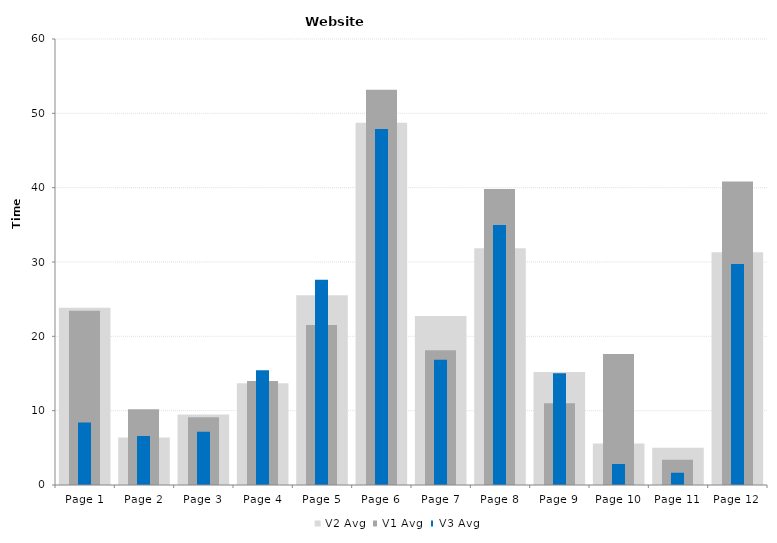
| Category | V2 Avg | V1 Avg | V3 Avg |
|---|---|---|---|
| Page 1 | 23.843 | 23.445 | 8.395 |
| Page 2 | 6.378 | 10.19 | 6.59 |
| Page 3 | 9.493 | 9.13 | 7.175 |
| Page 4 | 13.68 | 13.98 | 15.45 |
| Page 5 | 25.535 | 21.52 | 27.605 |
| Page 6 | 48.722 | 53.16 | 47.885 |
| Page 7 | 22.725 | 18.14 | 16.835 |
| Page 8 | 31.84 | 39.825 | 34.975 |
| Page 9 | 15.197 | 11 | 15.03 |
| Page 10 | 5.592 | 17.62 | 2.82 |
| Page 11 | 5.022 | 3.39 | 1.635 |
| Page 12 | 31.307 | 40.815 | 29.735 |